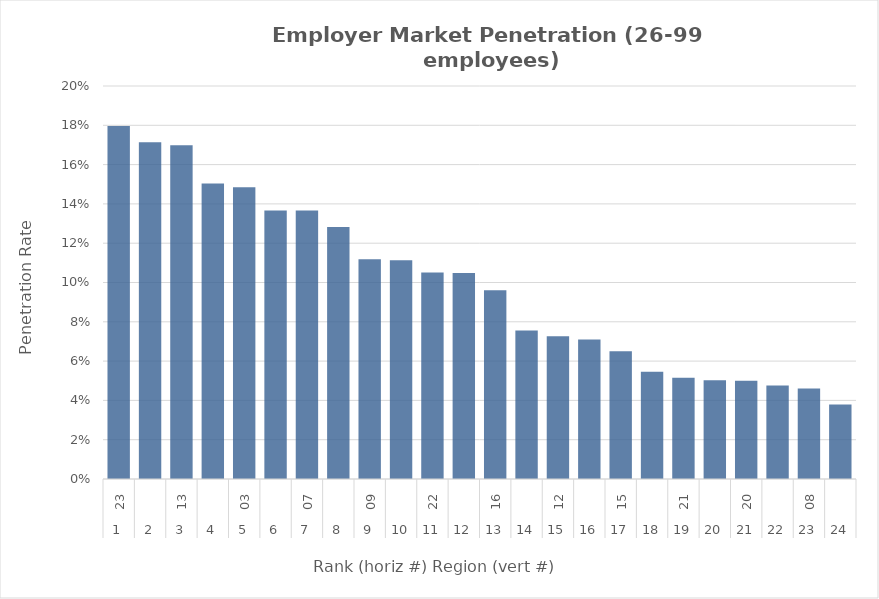
| Category | Rate |
|---|---|
| 0 | 0.18 |
| 1 | 0.171 |
| 2 | 0.17 |
| 3 | 0.15 |
| 4 | 0.148 |
| 5 | 0.137 |
| 6 | 0.137 |
| 7 | 0.128 |
| 8 | 0.112 |
| 9 | 0.111 |
| 10 | 0.105 |
| 11 | 0.105 |
| 12 | 0.096 |
| 13 | 0.076 |
| 14 | 0.073 |
| 15 | 0.071 |
| 16 | 0.065 |
| 17 | 0.055 |
| 18 | 0.052 |
| 19 | 0.05 |
| 20 | 0.05 |
| 21 | 0.048 |
| 22 | 0.046 |
| 23 | 0.038 |